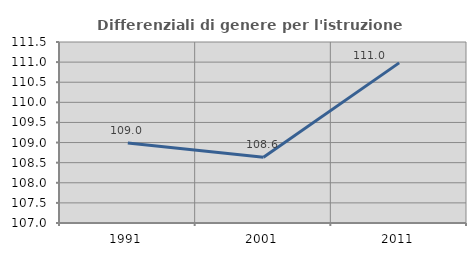
| Category | Differenziali di genere per l'istruzione superiore |
|---|---|
| 1991.0 | 108.991 |
| 2001.0 | 108.633 |
| 2011.0 | 110.981 |